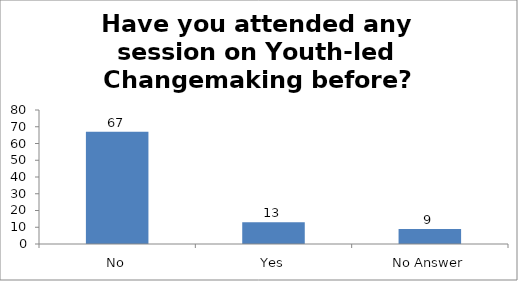
| Category | Have you attended any session on Youth-led Changemaking before? |
|---|---|
| No | 67 |
| Yes | 13 |
| No Answer | 9 |